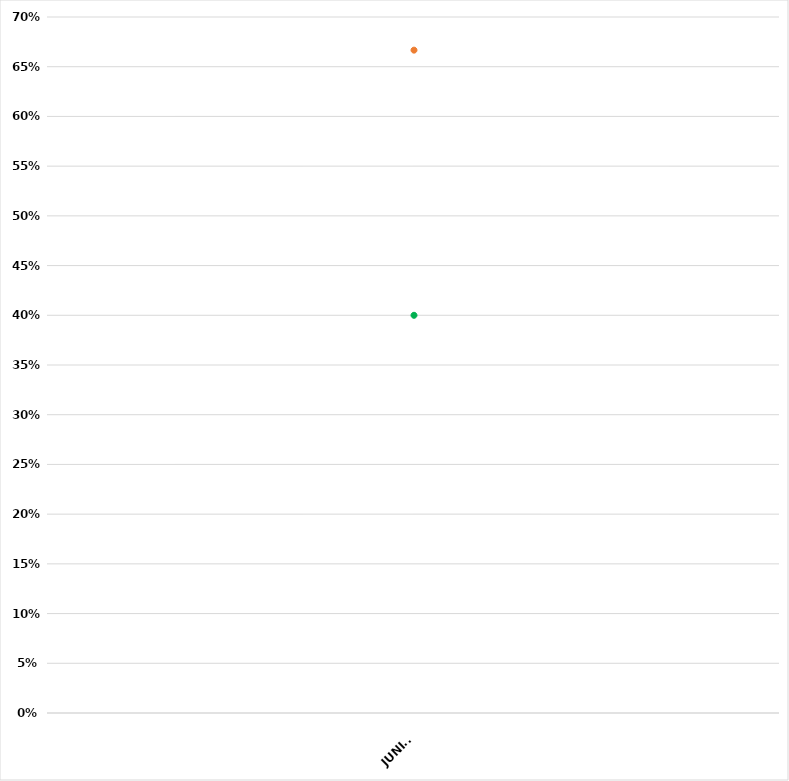
| Category | VALOR  | META PONDERADA |
|---|---|---|
| JUNIO | 0.667 | 0.4 |